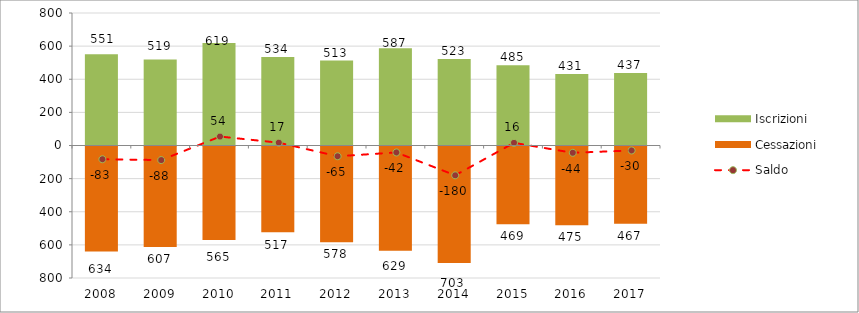
| Category | Iscrizioni | Cessazioni |
|---|---|---|
| 2008.0 | 551 | -634 |
| 2009.0 | 519 | -607 |
| 2010.0 | 619 | -565 |
| 2011.0 | 534 | -517 |
| 2012.0 | 513 | -578 |
| 2013.0 | 587 | -629 |
| 2014.0 | 523 | -703 |
| 2015.0 | 485 | -469 |
| 2016.0 | 431 | -475 |
| 2017.0 | 437 | -467 |